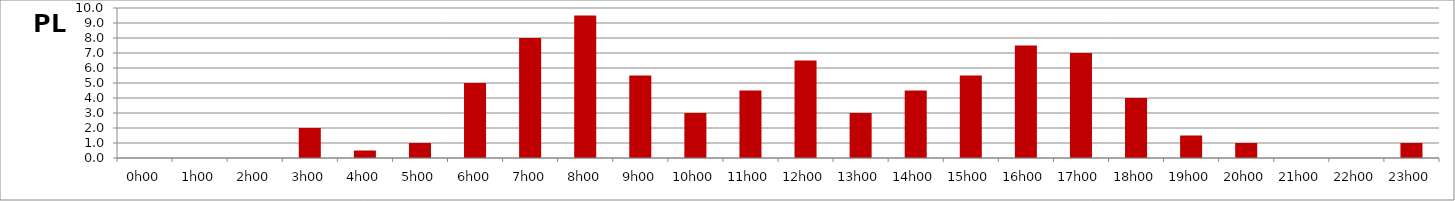
| Category | PL |
|---|---|
| 0.0 | 0 |
| 0.041666666666666664 | 0 |
| 0.08333333333333333 | 0 |
| 0.125 | 2 |
| 0.16666666666666666 | 0.5 |
| 0.20833333333333334 | 1 |
| 0.25 | 5 |
| 0.2916666666666667 | 8 |
| 0.3333333333333333 | 9.5 |
| 0.375 | 5.5 |
| 0.4166666666666667 | 3 |
| 0.4583333333333333 | 4.5 |
| 0.5 | 6.5 |
| 0.5416666666666666 | 3 |
| 0.5833333333333334 | 4.5 |
| 0.625 | 5.5 |
| 0.6666666666666666 | 7.5 |
| 0.7083333333333334 | 7 |
| 0.75 | 4 |
| 0.7916666666666666 | 1.5 |
| 0.8333333333333334 | 1 |
| 0.875 | 0 |
| 0.9166666666666666 | 0 |
| 0.9583333333333334 | 1 |